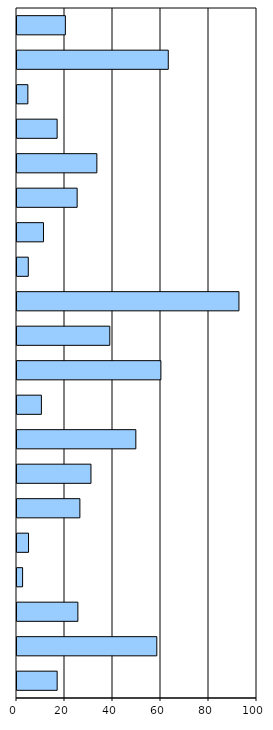
| Category | Series 0 |
|---|---|
| 0 | 16.736 |
| 1 | 58.256 |
| 2 | 25.369 |
| 3 | 2.331 |
| 4 | 4.811 |
| 5 | 26.201 |
| 6 | 30.818 |
| 7 | 49.517 |
| 8 | 10.165 |
| 9 | 59.956 |
| 10 | 38.663 |
| 11 | 92.48 |
| 12 | 4.702 |
| 13 | 11.037 |
| 14 | 25.059 |
| 15 | 33.279 |
| 16 | 16.724 |
| 17 | 4.53 |
| 18 | 63.03 |
| 19 | 20.154 |